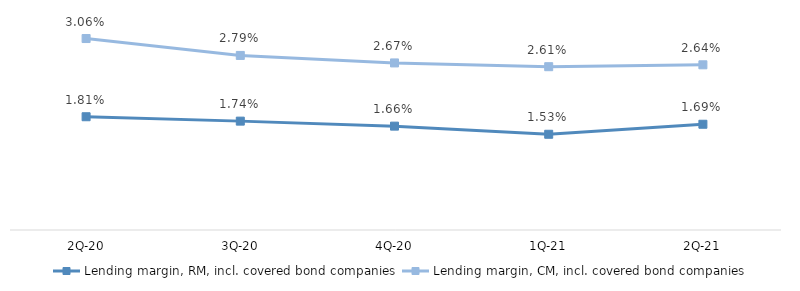
| Category | Lending margin, RM, incl. covered bond companies | Lending margin, CM, incl. covered bond companies |
|---|---|---|
| 2Q-21 | 0.017 | 0.026 |
| 1Q-21 | 0.015 | 0.026 |
| 4Q-20 | 0.017 | 0.027 |
| 3Q-20 | 0.017 | 0.028 |
| 2Q-20 | 0.018 | 0.031 |